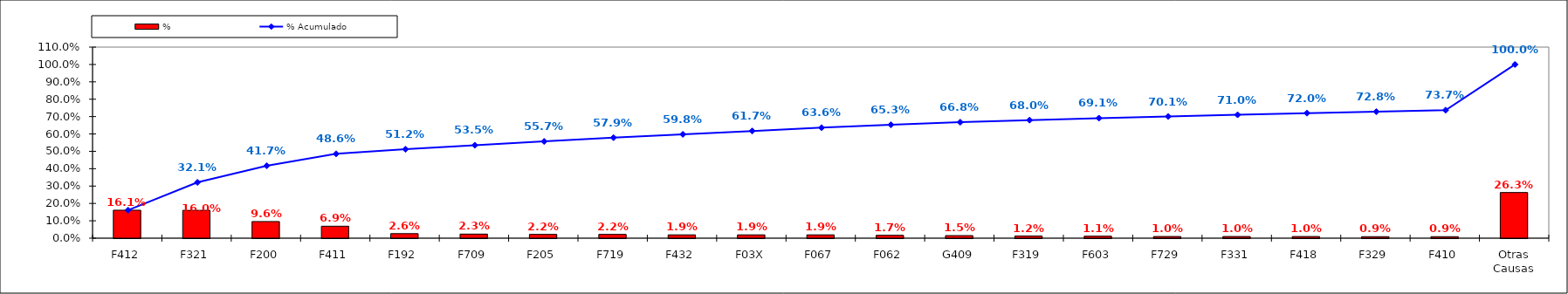
| Category | % |
|---|---|
| F412 | 0.161 |
| F321 | 0.16 |
| F200 | 0.096 |
| F411 | 0.069 |
| F192 | 0.026 |
| F709 | 0.023 |
| F205 | 0.022 |
| F719 | 0.022 |
| F432 | 0.019 |
| F03X | 0.019 |
| F067 | 0.019 |
| F062 | 0.017 |
| G409 | 0.015 |
| F319 | 0.012 |
| F603 | 0.011 |
| F729 | 0.01 |
| F331 | 0.01 |
| F418 | 0.01 |
| F329 | 0.009 |
| F410 | 0.009 |
| Otras Causas | 0.263 |